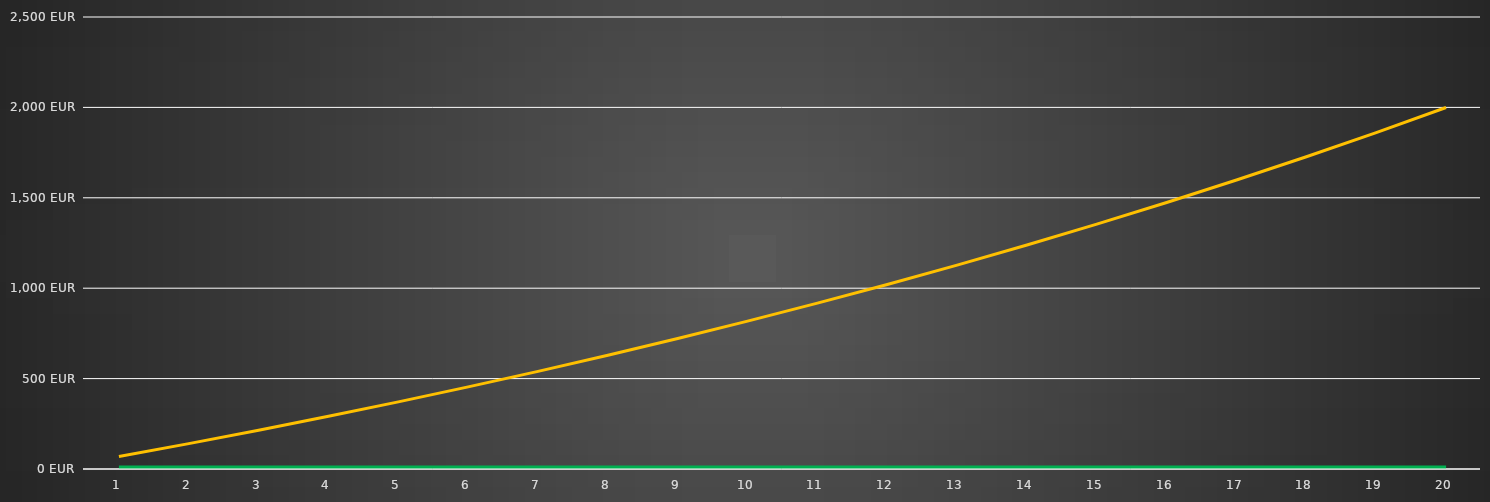
| Category | Series 0 | Series 1 |
|---|---|---|
| 0 | 68.9 | 0 |
| 1 | 140.384 | 0 |
| 2 | 214.55 | 0 |
| 3 | 291.498 | 0 |
| 4 | 371.332 | 0 |
| 5 | 454.161 | 0 |
| 6 | 540.096 | 0 |
| 7 | 629.255 | 0 |
| 8 | 721.759 | 0 |
| 9 | 817.732 | 0 |
| 10 | 917.305 | 0 |
| 11 | 1020.613 | 0 |
| 12 | 1127.796 | 0 |
| 13 | 1239 | 0 |
| 14 | 1354.375 | 0 |
| 15 | 1474.077 | 0 |
| 16 | 1598.27 | 0 |
| 17 | 1727.121 | 0 |
| 18 | 1860.806 | 0 |
| 19 | 1999.504 | 0 |